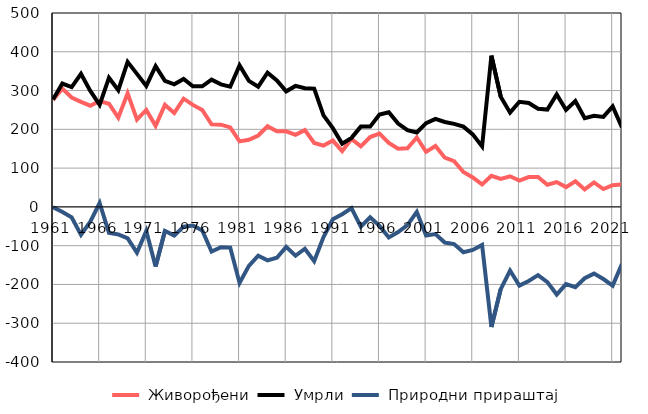
| Category |  Живорођени |  Умрли |  Природни прираштај |
|---|---|---|---|
| 1961.0 | 276 | 277 | -1 |
| 1962.0 | 305 | 318 | -13 |
| 1963.0 | 282 | 309 | -27 |
| 1964.0 | 271 | 343 | -72 |
| 1965.0 | 261 | 299 | -38 |
| 1966.0 | 273 | 263 | 10 |
| 1967.0 | 266 | 333 | -67 |
| 1968.0 | 230 | 301 | -71 |
| 1969.0 | 293 | 374 | -81 |
| 1970.0 | 225 | 343 | -118 |
| 1971.0 | 250 | 312 | -62 |
| 1972.0 | 209 | 363 | -154 |
| 1973.0 | 263 | 325 | -62 |
| 1974.0 | 242 | 316 | -74 |
| 1975.0 | 279 | 330 | -51 |
| 1976.0 | 263 | 311 | -48 |
| 1977.0 | 250 | 311 | -61 |
| 1978.0 | 213 | 328 | -115 |
| 1979.0 | 212 | 316 | -104 |
| 1980.0 | 205 | 310 | -105 |
| 1981.0 | 169 | 365 | -196 |
| 1982.0 | 173 | 325 | -152 |
| 1983.0 | 184 | 310 | -126 |
| 1984.0 | 208 | 346 | -138 |
| 1985.0 | 195 | 326 | -131 |
| 1986.0 | 195 | 298 | -103 |
| 1987.0 | 186 | 312 | -126 |
| 1988.0 | 198 | 306 | -108 |
| 1989.0 | 165 | 305 | -140 |
| 1990.0 | 158 | 236 | -78 |
| 1991.0 | 171 | 203 | -32 |
| 1992.0 | 144 | 163 | -19 |
| 1993.0 | 175 | 178 | -3 |
| 1994.0 | 156 | 207 | -51 |
| 1995.0 | 180 | 207 | -27 |
| 1996.0 | 189 | 238 | -49 |
| 1997.0 | 165 | 244 | -79 |
| 1998.0 | 150 | 215 | -65 |
| 1999.0 | 151 | 198 | -47 |
| 2000.0 | 179 | 192 | -13 |
| 2001.0 | 142 | 216 | -74 |
| 2002.0 | 157 | 227 | -70 |
| 2003.0 | 127 | 219 | -92 |
| 2004.0 | 118 | 214 | -96 |
| 2005.0 | 90 | 207 | -117 |
| 2006.0 | 76 | 187 | -111 |
| 2007.0 | 58 | 156 | -98 |
| 2008.0 | 80 | 390 | -310 |
| 2009.0 | 72 | 284 | -212 |
| 2010.0 | 79 | 243 | -164 |
| 2011.0 | 68 | 271 | -203 |
| 2012.0 | 77 | 268 | -191 |
| 2013.0 | 77 | 253 | -176 |
| 2014.0 | 57 | 251 | -194 |
| 2015.0 | 64 | 290 | -226 |
| 2016.0 | 51 | 250 | -199 |
| 2017.0 | 66 | 273 | -207 |
| 2018.0 | 45 | 229 | -184 |
| 2019.0 | 63 | 235 | -172 |
| 2020.0 | 46 | 232 | -186 |
| 2021.0 | 56 | 259 | -203 |
| 2022.0 | 58 | 205 | -147 |